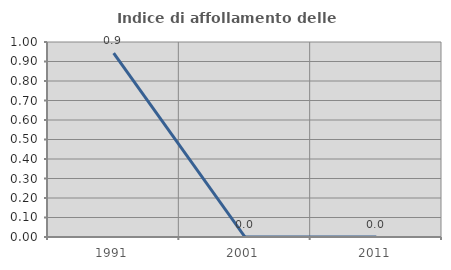
| Category | Indice di affollamento delle abitazioni  |
|---|---|
| 1991.0 | 0.943 |
| 2001.0 | 0 |
| 2011.0 | 0 |